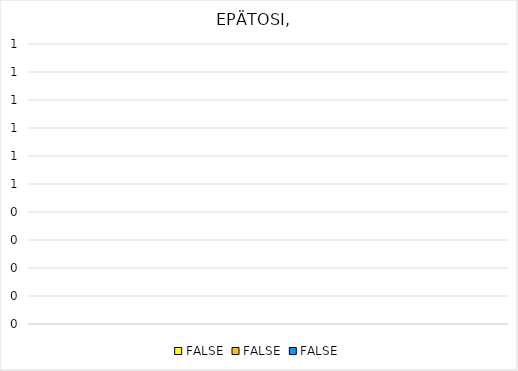
| Category | EPÄTOSI |
|---|---|
| 0 | 0 |